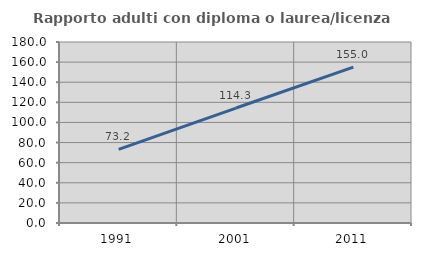
| Category | Rapporto adulti con diploma o laurea/licenza media  |
|---|---|
| 1991.0 | 73.235 |
| 2001.0 | 114.325 |
| 2011.0 | 154.959 |